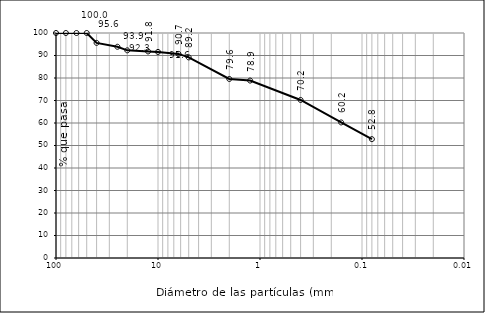
| Category | Series 0 |
|---|---|
| 100.0 | 100 |
| 80.0 | 100 |
| 63.0 | 100 |
| 50.0 | 100 |
| 40.0 | 95.61 |
| 25.0 | 93.884 |
| 20.0 | 92.29 |
| 12.5 | 91.807 |
| 10.0 | 91.583 |
| 6.3 | 90.702 |
| 5.0 | 89.164 |
| 2.0 | 79.578 |
| 1.25 | 78.863 |
| 0.4 | 70.245 |
| 0.16 | 60.248 |
| 0.08 | 52.823 |